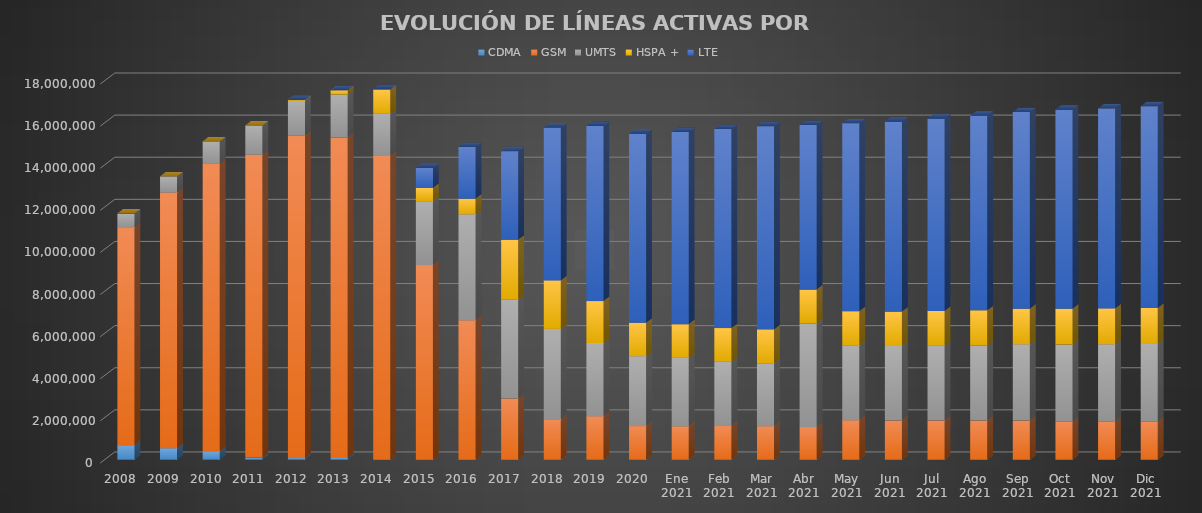
| Category | CDMA | GSM | UMTS | HSPA + | LTE |
|---|---|---|---|---|---|
| 2008 | 688357 | 10346902 | 656989 | 0 | 0 |
| 2009 | 544313 | 12151710 | 758577 | 0 | 0 |
| 2010 | 389834 | 13657394 | 1071603 | 0 | 0 |
| 2011 | 102115 | 14379423 | 1393020 | 0 | 0 |
| 2012 | 75179 | 15310006 | 1658596 | 43082 | 0 |
| 2013 | 83748 | 15215287 | 2043321 | 199398 | 0 |
| 2014 | 3009 | 14418144 | 2006405 | 1148823 | 28176 |
| 2015 | 0 | 9252920 | 3019889 | 636488 | 949723 |
| 2016 | 0 | 6621574 | 5027714 | 748032 | 2450814 |
| 2017 | 0 | 2903370.634 | 4688270.066 | 2852941.199 | 4206822.101 |
| 2018 | 0 | 1909938.891 | 4302462.415 | 2301651 | 7258785.694 |
| 2019 | 0 | 2068130.505 | 3468519.705 | 1995507 | 8320942.79 |
| 2020 | 0 | 1595680.621 | 3315009.099 | 1591073 | 8983603.28 |
| Ene 2021 | 0 | 1587783.73 | 3249285.841 | 1594963 | 9130917.428 |
| Feb 2021 | 0 | 1598501 | 3049945 | 1602560 | 9450529 |
| Mar 2021 | 0 | 1593140.519 | 2980982.345 | 1614608 | 9651821.135 |
| Abr 2021 | 0 | 1550141.025 | 4914584.364 | 1619119 | 7810763.612 |
| May 2021 | 0 | 1876083.657 | 3550221.948 | 1626722 | 8923231.396 |
| Jun 2021 | 0 | 1861585.656 | 3537165.914 | 1635292 | 9026579.43 |
| Jul 2021 | 0 | 1859157.489 | 3548309.999 | 1658122 | 9140090.512 |
| Ago 2021 | 0 | 1857417.703 | 3560196.034 | 1676681 | 9243645.262 |
| Sep 2021 | 0 | 1858130.233 | 3621242.579 | 1692698 | 9337762.188 |
| Oct 2021 | 0 | 1802963.086 | 3668537.033 | 1698733 | 9460495.882 |
| Nov 2021 | 0 | 1804002.693 | 3677682.384 | 1704356 | 9500109.923 |
| Dic 2021 | 0 | 1804531 | 3688873 | 1717066 | 9579130 |